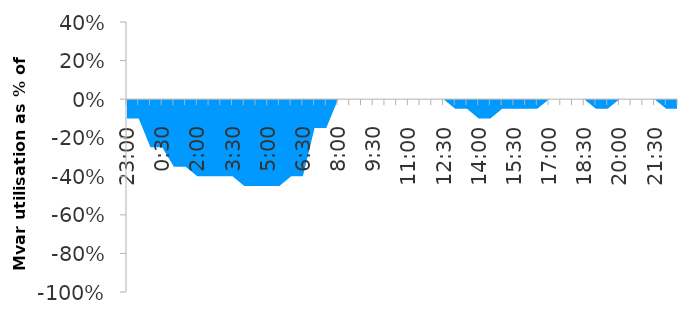
| Category | Series 0 |
|---|---|
| 0.9583333333333334 | -0.1 |
| 0.9791666666666666 | -0.1 |
| 0.0 | -0.25 |
| 0.020833333333333332 | -0.25 |
| 0.041666666666666664 | -0.35 |
| 0.0625 | -0.35 |
| 0.08333333333333333 | -0.4 |
| 0.10416666666666667 | -0.4 |
| 0.125 | -0.4 |
| 0.14583333333333334 | -0.4 |
| 0.16666666666666666 | -0.45 |
| 0.1875 | -0.45 |
| 0.20833333333333334 | -0.45 |
| 0.22916666666666666 | -0.45 |
| 0.25 | -0.4 |
| 0.2708333333333333 | -0.4 |
| 0.2916666666666667 | -0.15 |
| 0.3125 | -0.15 |
| 0.3333333333333333 | 0 |
| 0.3541666666666667 | 0 |
| 0.375 | 0 |
| 0.3958333333333333 | 0 |
| 0.4166666666666667 | 0 |
| 0.4375 | 0 |
| 0.4583333333333333 | 0 |
| 0.4791666666666667 | 0 |
| 0.5 | 0 |
| 0.5208333333333334 | 0 |
| 0.5416666666666666 | -0.05 |
| 0.5625 | -0.05 |
| 0.5833333333333334 | -0.1 |
| 0.6041666666666666 | -0.1 |
| 0.625 | -0.05 |
| 0.6458333333333334 | -0.05 |
| 0.6666666666666666 | -0.05 |
| 0.6875 | -0.05 |
| 0.7083333333333334 | 0 |
| 0.7291666666666666 | 0 |
| 0.75 | 0 |
| 0.7708333333333334 | 0 |
| 0.7916666666666666 | -0.05 |
| 0.8125 | -0.05 |
| 0.8333333333333334 | 0 |
| 0.8541666666666666 | 0 |
| 0.875 | 0 |
| 0.8958333333333334 | 0 |
| 0.9166666666666666 | -0.05 |
| 0.9375 | -0.05 |